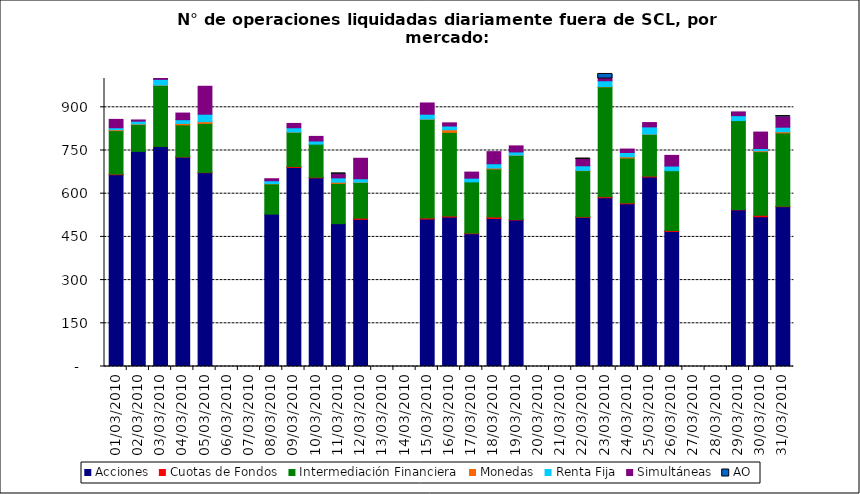
| Category | Acciones | Cuotas de Fondos | Intermediación Financiera | Monedas | Renta Fija | Simultáneas | AO |
|---|---|---|---|---|---|---|---|
| 01/03/2010 | 666 | 2 | 151 | 3 | 7 | 29 | 0 |
| 02/03/2010 | 747 | 0 | 93 | 2 | 10 | 4 | 0 |
| 03/03/2010 | 764 | 0 | 212 | 1 | 20 | 50 | 0 |
| 04/03/2010 | 727 | 1 | 111 | 5 | 13 | 23 | 0 |
| 05/03/2010 | 673 | 1 | 170 | 6 | 26 | 97 | 0 |
| 08/03/2010 | 529 | 0 | 105 | 1 | 10 | 7 | 0 |
| 09/03/2010 | 691 | 3 | 119 | 1 | 15 | 15 | 0 |
| 10/03/2010 | 655 | 2 | 115 | 0 | 11 | 16 | 0 |
| 11/03/2010 | 496 | 0 | 140 | 4 | 15 | 13 | 2 |
| 12/03/2010 | 511 | 4 | 124 | 1 | 12 | 71 | 0 |
| 15/03/2010 | 512 | 4 | 342 | 1 | 17 | 39 | 0 |
| 16/03/2010 | 519 | 4 | 290 | 9 | 13 | 11 | 0 |
| 17/03/2010 | 461 | 2 | 178 | 0 | 13 | 21 | 0 |
| 18/03/2010 | 514 | 5 | 167 | 3 | 15 | 42 | 0 |
| 19/03/2010 | 509 | 1 | 223 | 1 | 11 | 21 | 0 |
| 22/03/2010 | 518 | 2 | 160 | 1 | 16 | 23 | 1 |
| 23/03/2010 | 586 | 3 | 382 | 1 | 20 | 22 | 1 |
| 24/03/2010 | 565 | 3 | 156 | 4 | 15 | 12 | 0 |
| 25/03/2010 | 658 | 3 | 145 | 1 | 25 | 15 | 0 |
| 26/03/2010 | 469 | 3 | 208 | 0 | 16 | 37 | 0 |
| 29/03/2010 | 544 | 1 | 309 | 0 | 17 | 13 | 0 |
| 30/03/2010 | 520 | 5 | 221 | 3 | 8 | 57 | 0 |
| 31/03/2010 | 555 | 1 | 255 | 4 | 16 | 36 | 2 |